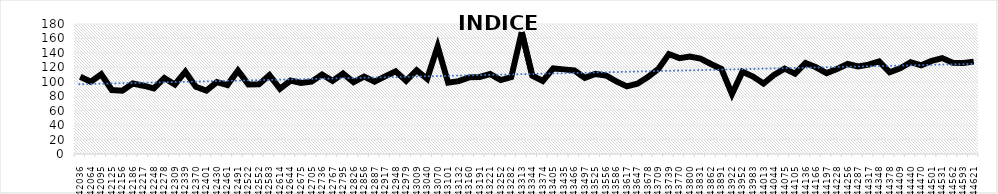
| Category | INDICE GLOBAL |
|---|---|
| 42036.0 | 107.045 |
| 42064.0 | 100.078 |
| 42095.0 | 110.342 |
| 42125.0 | 88.62 |
| 42156.0 | 87.722 |
| 42186.0 | 97.682 |
| 42217.0 | 94.541 |
| 42248.0 | 90.754 |
| 42278.0 | 105.26 |
| 42309.0 | 96.244 |
| 42339.0 | 113.987 |
| 42370.0 | 92.993 |
| 42401.0 | 87.882 |
| 42430.0 | 99.468 |
| 42461.0 | 95.388 |
| 42491.0 | 115.442 |
| 42522.0 | 96.246 |
| 42552.0 | 96.687 |
| 42583.0 | 109.257 |
| 42614.0 | 90.191 |
| 42644.0 | 101.662 |
| 42675.0 | 98.313 |
| 42705.0 | 100.089 |
| 42736.0 | 110.07 |
| 42767.0 | 101.266 |
| 42795.0 | 111.371 |
| 42826.0 | 99.61 |
| 42856.0 | 107.315 |
| 42887.0 | 100.167 |
| 42917.0 | 107.462 |
| 42948.0 | 114.393 |
| 42979.0 | 101.146 |
| 43009.0 | 115.978 |
| 43040.0 | 104.125 |
| 43070.0 | 148.874 |
| 43101.0 | 98.653 |
| 43132.0 | 100.817 |
| 43160.0 | 106.098 |
| 43191.0 | 106.601 |
| 43221.0 | 110.662 |
| 43252.0 | 102.387 |
| 43282.0 | 106.489 |
| 43313.0 | 168.787 |
| 43344.0 | 108.561 |
| 43374.0 | 101.045 |
| 43405.0 | 118.496 |
| 43435.0 | 117.158 |
| 43466.0 | 115.665 |
| 43497.0 | 105.534 |
| 43525.0 | 110.852 |
| 43556.0 | 108.717 |
| 43586.0 | 100.574 |
| 43617.0 | 93.577 |
| 43647.0 | 97.28 |
| 43678.0 | 106.416 |
| 43709.0 | 117.796 |
| 43739.0 | 138.381 |
| 43770.0 | 132.698 |
| 43800.0 | 135.024 |
| 43831.0 | 132.095 |
| 43862.0 | 124.628 |
| 43891.0 | 117.603 |
| 43922.0 | 83.019 |
| 43952.0 | 113.789 |
| 43983.0 | 107.216 |
| 44013.0 | 97.596 |
| 44044.0 | 109.393 |
| 44075.0 | 118.197 |
| 44105.0 | 111.177 |
| 44136.0 | 125.92 |
| 44166.0 | 120.08 |
| 44197.0 | 112.016 |
| 44228.0 | 117.756 |
| 44256.0 | 124.614 |
| 44287.0 | 121.226 |
| 44317.0 | 123.69 |
| 44348.0 | 128.198 |
| 44378.0 | 113.209 |
| 44409.0 | 118.763 |
| 44440.0 | 127.123 |
| 44470.0 | 122.714 |
| 44501.0 | 128.872 |
| 44531.0 | 132.802 |
| 44562.0 | 126.335 |
| 44593.0 | 125.924 |
| 44621.0 | 127.934 |